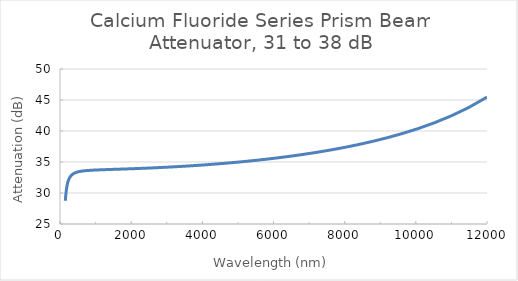
| Category | Calcium Fluoride Series Prism Beam Attenuator, 31 to 38 dB |
|---|---|
| 150.0 | 28.743 |
| 156.70000000000002 | 29.27 |
| 163.70000000000002 | 29.732 |
| 171.1 | 30.142 |
| 178.7 | 30.498 |
| 186.70000000000002 | 30.816 |
| 195.1 | 31.1 |
| 203.8 | 31.352 |
| 213.0 | 31.579 |
| 222.5 | 31.781 |
| 232.5 | 31.963 |
| 242.9 | 32.127 |
| 253.8 | 32.275 |
| 265.2 | 32.408 |
| 277.0 | 32.528 |
| 289.4 | 32.637 |
| 302.4 | 32.736 |
| 315.90000000000003 | 32.826 |
| 330.1 | 32.908 |
| 344.9 | 32.982 |
| 360.3 | 33.05 |
| 376.5 | 33.112 |
| 393.29999999999995 | 33.167 |
| 411.0 | 33.219 |
| 429.4 | 33.266 |
| 448.6 | 33.309 |
| 468.7 | 33.348 |
| 489.70000000000005 | 33.384 |
| 511.6000000000001 | 33.417 |
| 534.5 | 33.447 |
| 558.5 | 33.475 |
| 583.5 | 33.501 |
| 609.6 | 33.524 |
| 637.0 | 33.546 |
| 665.5 | 33.566 |
| 695.3000000000001 | 33.585 |
| 726.4000000000001 | 33.603 |
| 759.0 | 33.619 |
| 793.0 | 33.635 |
| 828.5 | 33.649 |
| 865.6 | 33.663 |
| 904.4 | 33.676 |
| 944.9 | 33.689 |
| 987.1999999999999 | 33.701 |
| 1031.0 | 33.712 |
| 1078.0 | 33.724 |
| 1126.0 | 33.735 |
| 1176.0 | 33.747 |
| 1229.0 | 33.758 |
| 1284.0 | 33.769 |
| 1342.0 | 33.781 |
| 1402.0 | 33.792 |
| 1465.0 | 33.805 |
| 1530.0 | 33.817 |
| 1599.0 | 33.83 |
| 1670.0 | 33.844 |
| 1745.0 | 33.859 |
| 1823.0 | 33.874 |
| 1905.0 | 33.891 |
| 1990.0 | 33.908 |
| 2079.0 | 33.927 |
| 2173.0 | 33.948 |
| 2270.0 | 33.97 |
| 2372.0 | 33.993 |
| 2478.0 | 34.019 |
| 2589.0 | 34.047 |
| 2705.0 | 34.078 |
| 2826.0 | 34.111 |
| 2953.0 | 34.147 |
| 3085.0 | 34.186 |
| 3223.0 | 34.229 |
| 3367.0 | 34.277 |
| 3518.0 | 34.328 |
| 3676.0 | 34.385 |
| 3840.0 | 34.447 |
| 4011.9999999999995 | 34.516 |
| 4192.0 | 34.591 |
| 4380.0 | 34.674 |
| 4576.0 | 34.765 |
| 4781.0 | 34.866 |
| 4995.0 | 34.977 |
| 5219.0 | 35.1 |
| 5453.0 | 35.237 |
| 5697.0 | 35.388 |
| 5952.0 | 35.556 |
| 6219.0 | 35.743 |
| 6498.0 | 35.953 |
| 6789.0 | 36.187 |
| 7093.0 | 36.45 |
| 7410.0 | 36.745 |
| 7742.0 | 37.079 |
| 8089.0 | 37.459 |
| 8452.0 | 37.892 |
| 8830.0 | 38.387 |
| 9226.0 | 38.959 |
| 9639.0 | 39.623 |
| 10070.0 | 40.401 |
| 10520.0 | 41.321 |
| 10990.0 | 42.425 |
| 11490.0 | 43.798 |
| 12000.0 | 45.467 |